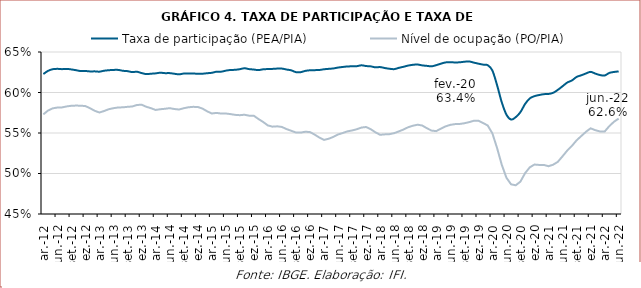
| Category | Taxa de participação (PEA/PIA) | Nível de ocupação (PO/PIA) |
|---|---|---|
| 2012-03-01 | 0.623 | 0.573 |
| 2012-04-01 | 0.627 | 0.578 |
| 2012-05-01 | 0.629 | 0.58 |
| 2012-06-01 | 0.629 | 0.581 |
| 2012-07-01 | 0.629 | 0.582 |
| 2012-08-01 | 0.629 | 0.583 |
| 2012-09-01 | 0.628 | 0.584 |
| 2012-10-01 | 0.628 | 0.584 |
| 2012-11-01 | 0.626 | 0.584 |
| 2012-12-01 | 0.627 | 0.583 |
| 2013-01-01 | 0.626 | 0.581 |
| 2013-02-01 | 0.626 | 0.577 |
| 2013-03-01 | 0.626 | 0.575 |
| 2013-04-01 | 0.627 | 0.577 |
| 2013-05-01 | 0.628 | 0.579 |
| 2013-06-01 | 0.628 | 0.581 |
| 2013-07-01 | 0.628 | 0.582 |
| 2013-08-01 | 0.627 | 0.582 |
| 2013-09-01 | 0.626 | 0.582 |
| 2013-10-01 | 0.625 | 0.583 |
| 2013-11-01 | 0.626 | 0.585 |
| 2013-12-01 | 0.624 | 0.585 |
| 2014-01-01 | 0.623 | 0.582 |
| 2014-02-01 | 0.623 | 0.581 |
| 2014-03-01 | 0.624 | 0.578 |
| 2014-04-01 | 0.624 | 0.579 |
| 2014-05-01 | 0.624 | 0.58 |
| 2014-06-01 | 0.624 | 0.581 |
| 2014-07-01 | 0.623 | 0.58 |
| 2014-08-01 | 0.622 | 0.579 |
| 2014-09-01 | 0.623 | 0.581 |
| 2014-10-01 | 0.624 | 0.582 |
| 2014-11-01 | 0.623 | 0.582 |
| 2014-12-01 | 0.623 | 0.582 |
| 2015-01-01 | 0.623 | 0.58 |
| 2015-02-01 | 0.624 | 0.577 |
| 2015-03-01 | 0.624 | 0.574 |
| 2015-04-01 | 0.626 | 0.575 |
| 2015-05-01 | 0.626 | 0.574 |
| 2015-06-01 | 0.627 | 0.574 |
| 2015-07-01 | 0.628 | 0.573 |
| 2015-08-01 | 0.628 | 0.572 |
| 2015-09-01 | 0.629 | 0.572 |
| 2015-10-01 | 0.63 | 0.573 |
| 2015-11-01 | 0.629 | 0.571 |
| 2015-12-01 | 0.628 | 0.571 |
| 2016-01-01 | 0.628 | 0.567 |
| 2016-02-01 | 0.629 | 0.564 |
| 2016-03-01 | 0.629 | 0.559 |
| 2016-04-01 | 0.629 | 0.558 |
| 2016-05-01 | 0.63 | 0.558 |
| 2016-06-01 | 0.63 | 0.557 |
| 2016-07-01 | 0.628 | 0.555 |
| 2016-08-01 | 0.627 | 0.553 |
| 2016-09-01 | 0.625 | 0.551 |
| 2016-10-01 | 0.625 | 0.55 |
| 2016-11-01 | 0.627 | 0.552 |
| 2016-12-01 | 0.627 | 0.551 |
| 2017-01-01 | 0.628 | 0.548 |
| 2017-02-01 | 0.628 | 0.544 |
| 2017-03-01 | 0.629 | 0.541 |
| 2017-04-01 | 0.629 | 0.543 |
| 2017-05-01 | 0.63 | 0.545 |
| 2017-06-01 | 0.631 | 0.548 |
| 2017-07-01 | 0.632 | 0.55 |
| 2017-08-01 | 0.632 | 0.552 |
| 2017-09-01 | 0.632 | 0.553 |
| 2017-10-01 | 0.632 | 0.555 |
| 2017-11-01 | 0.634 | 0.557 |
| 2017-12-01 | 0.633 | 0.557 |
| 2018-01-01 | 0.632 | 0.555 |
| 2018-02-01 | 0.631 | 0.551 |
| 2018-03-01 | 0.631 | 0.548 |
| 2018-04-01 | 0.63 | 0.548 |
| 2018-05-01 | 0.629 | 0.549 |
| 2018-06-01 | 0.629 | 0.55 |
| 2018-07-01 | 0.63 | 0.552 |
| 2018-08-01 | 0.632 | 0.554 |
| 2018-09-01 | 0.633 | 0.557 |
| 2018-10-01 | 0.634 | 0.559 |
| 2018-11-01 | 0.635 | 0.56 |
| 2018-12-01 | 0.633 | 0.559 |
| 2019-01-01 | 0.633 | 0.556 |
| 2019-02-01 | 0.632 | 0.553 |
| 2019-03-01 | 0.634 | 0.552 |
| 2019-04-01 | 0.636 | 0.555 |
| 2019-05-01 | 0.637 | 0.558 |
| 2019-06-01 | 0.637 | 0.56 |
| 2019-07-01 | 0.637 | 0.561 |
| 2019-08-01 | 0.637 | 0.561 |
| 2019-09-01 | 0.638 | 0.562 |
| 2019-10-01 | 0.638 | 0.563 |
| 2019-11-01 | 0.637 | 0.565 |
| 2019-12-01 | 0.636 | 0.565 |
| 2020-01-01 | 0.634 | 0.562 |
| 2020-02-01 | 0.634 | 0.559 |
| 2020-03-01 | 0.627 | 0.55 |
| 2020-04-01 | 0.609 | 0.532 |
| 2020-05-01 | 0.588 | 0.511 |
| 2020-06-01 | 0.573 | 0.495 |
| 2020-07-01 | 0.567 | 0.487 |
| 2020-08-01 | 0.57 | 0.485 |
| 2020-09-01 | 0.576 | 0.49 |
| 2020-10-01 | 0.586 | 0.5 |
| 2020-11-01 | 0.593 | 0.508 |
| 2020-12-01 | 0.595 | 0.511 |
| 2021-01-01 | 0.597 | 0.511 |
| 2021-02-01 | 0.598 | 0.511 |
| 2021-03-01 | 0.598 | 0.509 |
| 2021-04-01 | 0.6 | 0.511 |
| 2021-05-01 | 0.603 | 0.514 |
| 2021-06-01 | 0.608 | 0.521 |
| 2021-07-01 | 0.612 | 0.528 |
| 2021-08-01 | 0.615 | 0.534 |
| 2021-09-01 | 0.619 | 0.541 |
| 2021-10-01 | 0.621 | 0.546 |
| 2021-11-01 | 0.623 | 0.551 |
| 2021-12-01 | 0.625 | 0.556 |
| 2022-01-01 | 0.623 | 0.553 |
| 2022-02-01 | 0.622 | 0.552 |
| 2022-03-01 | 0.621 | 0.552 |
| 2022-04-01 | 0.624 | 0.558 |
| 2022-05-01 | 0.625 | 0.564 |
| 2022-06-01 | 0.626 | 0.568 |